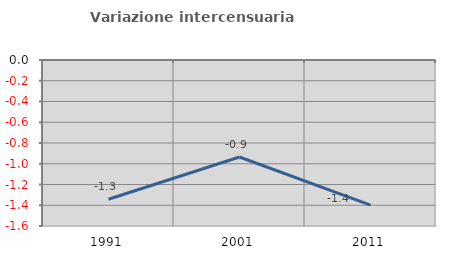
| Category | Variazione intercensuaria annua |
|---|---|
| 1991.0 | -1.342 |
| 2001.0 | -0.935 |
| 2011.0 | -1.4 |